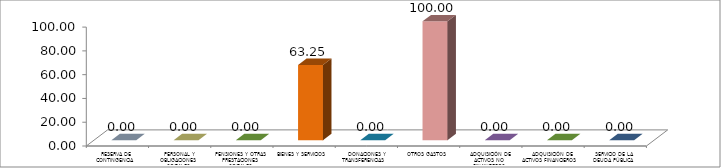
| Category | Series 0 |
|---|---|
|  RESERVA DE CONTINGENCIA | 0 |
|  PERSONAL Y OBLIGACIONES SOCIALES | 0 |
|  PENSIONES Y OTRAS PRESTACIONES SOCIALES | 0 |
|  BIENES Y SERVICIOS | 63.246 |
|   DONACIONES Y TRANSFERENCIAS | 0 |
|  OTROS GASTOS | 100 |
|  ADQUISICIÓN DE ACTIVOS NO FINANCIEROS | 0 |
|  ADQUISICIÓN DE ACTIVOS FINANCIEROS | 0 |
|  SERVICIO DE LA DEUDA PÚBLICA | 0 |